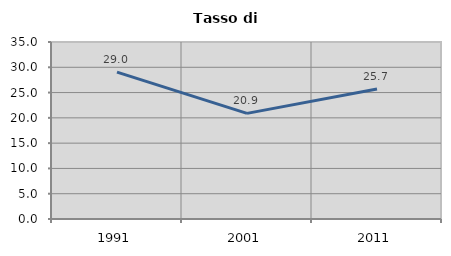
| Category | Tasso di disoccupazione   |
|---|---|
| 1991.0 | 29.034 |
| 2001.0 | 20.888 |
| 2011.0 | 25.692 |